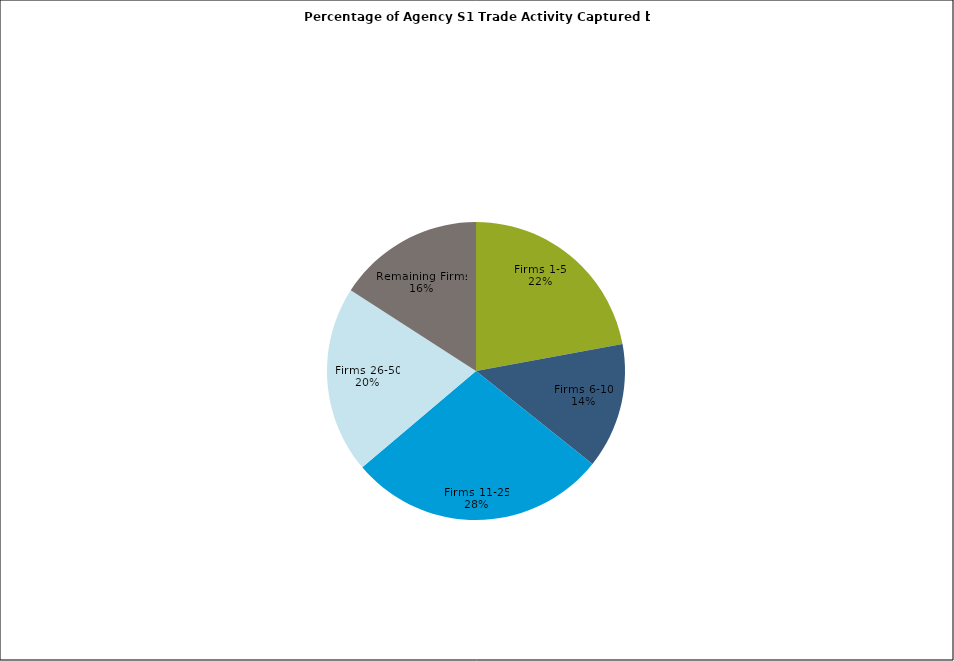
| Category | Series 0 |
|---|---|
| Firms 1-5 | 0.221 |
| Firms 6-10 | 0.136 |
| Firms 11-25 | 0.281 |
| Firms 26-50 | 0.203 |
| Remaining Firms | 0.159 |